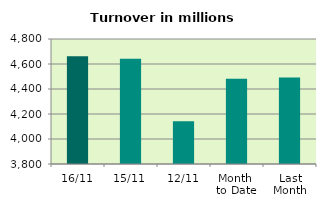
| Category | Series 0 |
|---|---|
| 16/11 | 4661.208 |
| 15/11 | 4641.987 |
| 12/11 | 4142.621 |
| Month 
to Date | 4482.131 |
| Last
Month | 4491.272 |